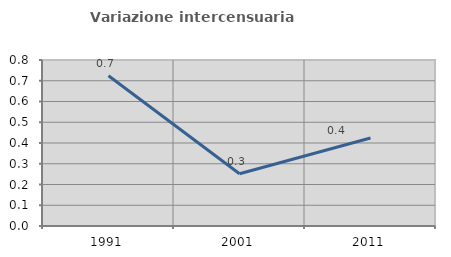
| Category | Variazione intercensuaria annua |
|---|---|
| 1991.0 | 0.724 |
| 2001.0 | 0.252 |
| 2011.0 | 0.424 |